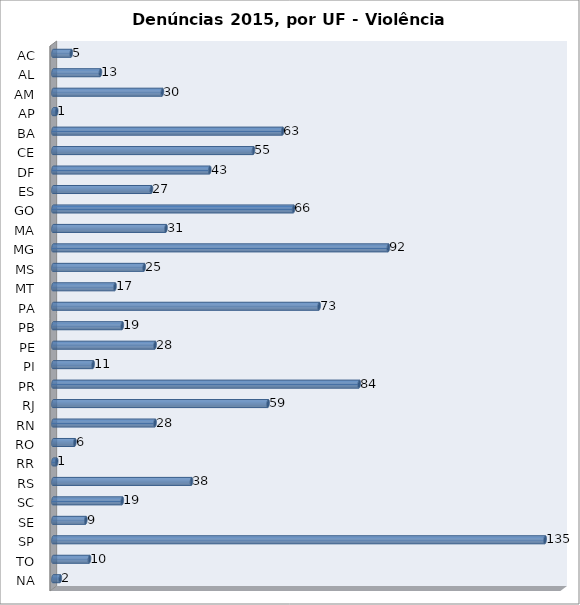
| Category | Series 0 |
|---|---|
| AC | 5 |
| AL | 13 |
| AM | 30 |
| AP | 1 |
| BA | 63 |
| CE | 55 |
| DF | 43 |
| ES | 27 |
| GO | 66 |
| MA | 31 |
| MG | 92 |
| MS | 25 |
| MT | 17 |
| PA | 73 |
| PB | 19 |
| PE | 28 |
| PI | 11 |
| PR | 84 |
| RJ | 59 |
| RN | 28 |
| RO | 6 |
| RR | 1 |
| RS | 38 |
| SC | 19 |
| SE | 9 |
| SP | 135 |
| TO | 10 |
| NA | 2 |